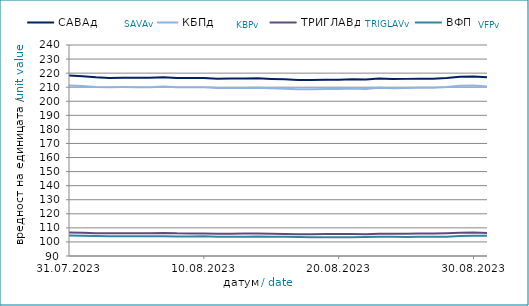
| Category | САВАд | КБПд | ТРИГЛАВд | ВФПд |
|---|---|---|---|---|
| 2023-07-31 | 218.344 | 211.285 | 106.678 | 104.553 |
| 2023-08-01 | 217.706 | 210.793 | 106.484 | 104.436 |
| 2023-08-02 | 217 | 210.087 | 106.194 | 104.163 |
| 2023-08-03 | 216.575 | 209.935 | 106.105 | 104.015 |
| 2023-08-04 | 216.798 | 210.063 | 106.118 | 104.106 |
| 2023-08-05 | 216.734 | 209.993 | 106.086 | 104.098 |
| 2023-08-06 | 216.741 | 210 | 106.091 | 104.105 |
| 2023-08-07 | 217.03 | 210.482 | 106.344 | 103.981 |
| 2023-08-08 | 216.526 | 209.924 | 106.094 | 103.834 |
| 2023-08-09 | 216.516 | 209.9 | 106.072 | 103.891 |
| 2023-08-10 | 216.525 | 209.888 | 106.054 | 104.057 |
| 2023-08-11 | 216.067 | 209.345 | 105.856 | 103.72 |
| 2023-08-12 | 216.155 | 209.441 | 105.904 | 103.744 |
| 2023-08-13 | 216.163 | 209.449 | 105.91 | 103.75 |
| 2023-08-14 | 216.333 | 209.565 | 105.969 | 103.864 |
| 2023-08-15 | 215.899 | 209.313 | 105.822 | 103.733 |
| 2023-08-16 | 215.578 | 208.873 | 105.609 | 103.68 |
| 2023-08-17 | 215.16 | 208.501 | 105.424 | 103.457 |
| 2023-08-18 | 215.151 | 208.549 | 105.46 | 103.251 |
| 2023-08-19 | 215.325 | 208.745 | 105.555 | 103.293 |
| 2023-08-20 | 215.332 | 208.753 | 105.561 | 103.299 |
| 2023-08-21 | 215.567 | 209.076 | 105.708 | 103.334 |
| 2023-08-22 | 215.432 | 208.737 | 105.527 | 103.554 |
| 2023-08-23 | 216.185 | 209.535 | 105.9 | 103.707 |
| 2023-08-24 | 215.751 | 209.252 | 105.763 | 103.637 |
| 2023-08-25 | 215.918 | 209.435 | 105.85 | 103.571 |
| 2023-08-26 | 216.084 | 209.622 | 105.942 | 103.611 |
| 2023-08-27 | 216.092 | 209.63 | 105.947 | 103.617 |
| 2023-08-28 | 216.545 | 210.115 | 106.175 | 103.765 |
| 2023-08-29 | 217.391 | 210.997 | 106.601 | 104.214 |
| 2023-08-30 | 217.519 | 211.161 | 106.711 | 104.317 |
| 2023-08-31 | 216.99 | 210.555 | 106.4 | 104.39 |